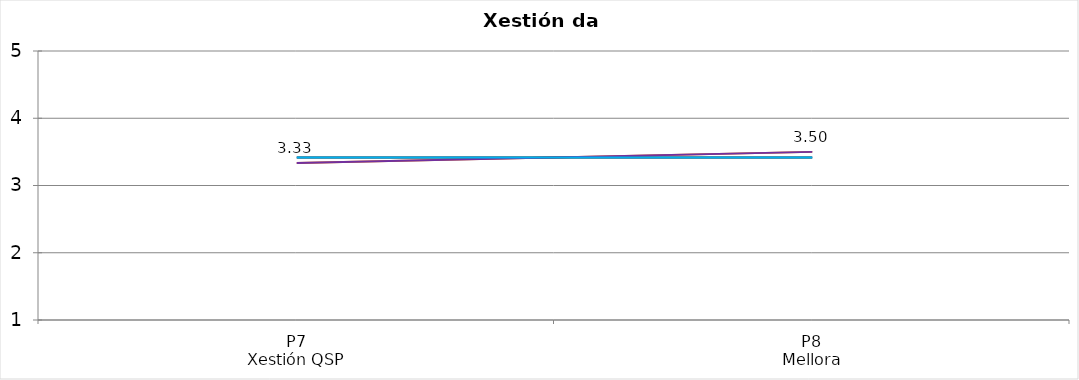
| Category | Valoración (1-5) | MEDIA |
|---|---|---|
| P7
Xestión QSP | 3.333 | 3.417 |
| P8
Mellora | 3.5 | 3.417 |